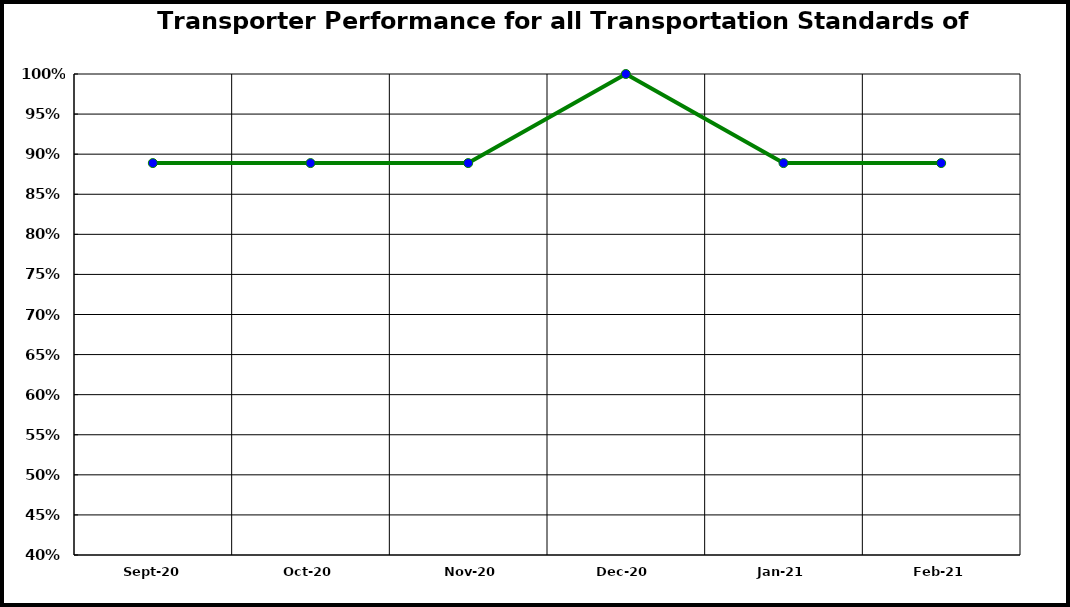
| Category | Performance |
|---|---|
| 2020-09-01 | 0.889 |
| 2020-10-01 | 0.889 |
| 2020-11-01 | 0.889 |
| 2020-12-01 | 1 |
| 2021-01-01 | 0.889 |
| 2021-02-01 | 0.889 |